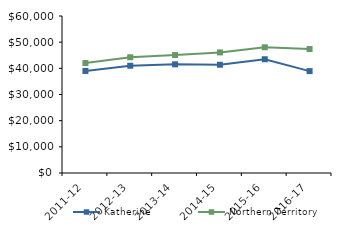
| Category | Katherine | Northern Territory |
|---|---|---|
| 2011-12 | 39000.35 | 42021 |
| 2012-13 | 40989.65 | 44232.02 |
| 2013-14 | 41532 | 45075.51 |
| 2014-15 | 41366 | 46083.65 |
| 2015-16 | 43470.05 | 48046.27 |
| 2016-17 | 38944.39 | 47367.05 |